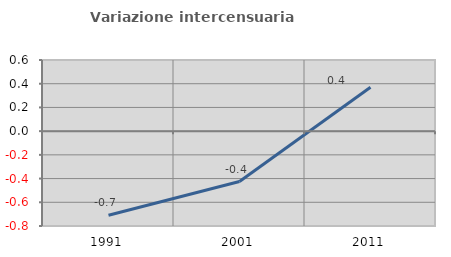
| Category | Variazione intercensuaria annua |
|---|---|
| 1991.0 | -0.71 |
| 2001.0 | -0.425 |
| 2011.0 | 0.37 |